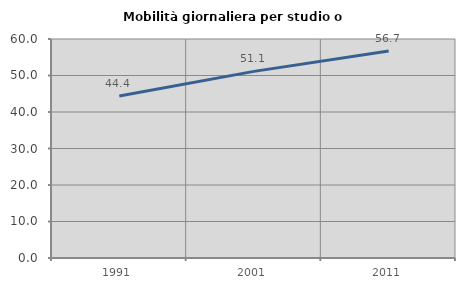
| Category | Mobilità giornaliera per studio o lavoro |
|---|---|
| 1991.0 | 44.357 |
| 2001.0 | 51.126 |
| 2011.0 | 56.735 |